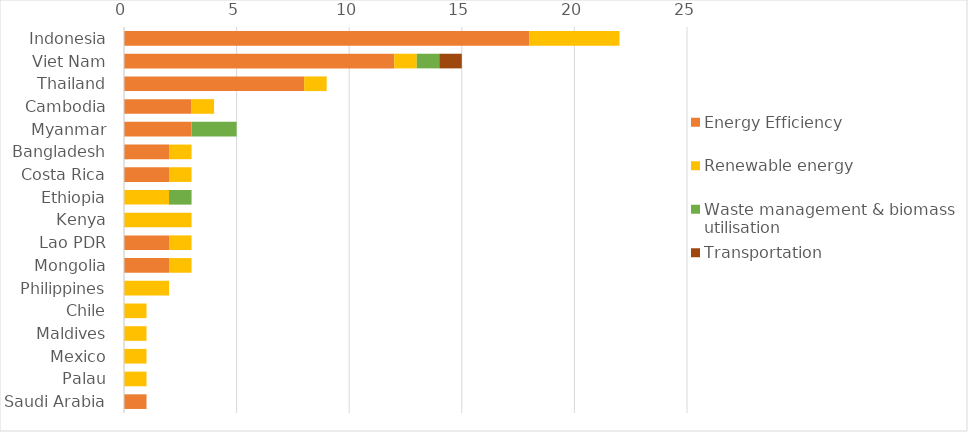
| Category | Energy Efficiency | Renewable energy | Waste management & biomass utilisation | Transportation |
|---|---|---|---|---|
| Indonesia | 18 | 4 | 0 | 0 |
| Viet Nam | 12 | 1 | 1 | 1 |
| Thailand | 8 | 1 | 0 | 0 |
| Cambodia | 3 | 1 | 0 | 0 |
| Myanmar | 3 | 0 | 2 | 0 |
| Bangladesh | 2 | 1 | 0 | 0 |
| Costa Rica | 2 | 1 | 0 | 0 |
| Ethiopia | 0 | 2 | 1 | 0 |
| Kenya | 0 | 3 | 0 | 0 |
| Lao PDR | 2 | 1 | 0 | 0 |
| Mongolia | 2 | 1 | 0 | 0 |
| Philippines | 0 | 2 | 0 | 0 |
| Chile | 0 | 1 | 0 | 0 |
| Maldives | 0 | 1 | 0 | 0 |
| Mexico | 0 | 1 | 0 | 0 |
| Palau | 0 | 1 | 0 | 0 |
| Saudi Arabia | 1 | 0 | 0 | 0 |